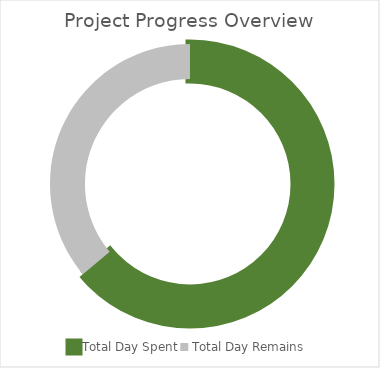
| Category | Series 0 |
|---|---|
| Total Day Spent | 251.6 |
| Total Day Remains | 142.4 |